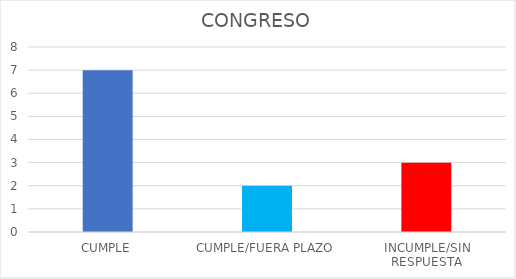
| Category | TOTAL |
|---|---|
| CUMPLE | 7 |
| CUMPLE/FUERA PLAZO | 2 |
| INCUMPLE/SIN RESPUESTA | 3 |